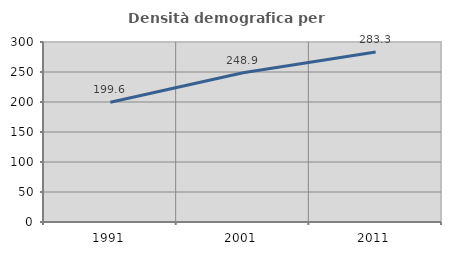
| Category | Densità demografica |
|---|---|
| 1991.0 | 199.602 |
| 2001.0 | 248.893 |
| 2011.0 | 283.329 |